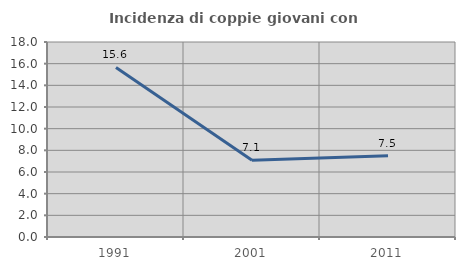
| Category | Incidenza di coppie giovani con figli |
|---|---|
| 1991.0 | 15.649 |
| 2001.0 | 7.075 |
| 2011.0 | 7.5 |